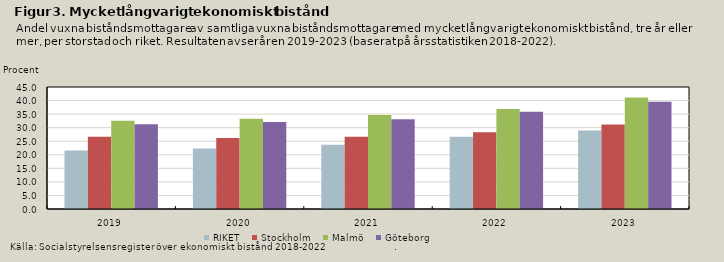
| Category | RIKET | Stockholm | Malmö | Göteborg |
|---|---|---|---|---|
| 2019.0 | 21.574 | 26.621 | 32.557 | 31.216 |
| 2020.0 | 22.317 | 26.196 | 33.32 | 32.131 |
| 2021.0 | 23.674 | 26.645 | 34.677 | 33.117 |
| 2022.0 | 26.643 | 28.327 | 36.883 | 35.905 |
| 2023.0 | 28.967 | 31.132 | 41.17 | 39.539 |